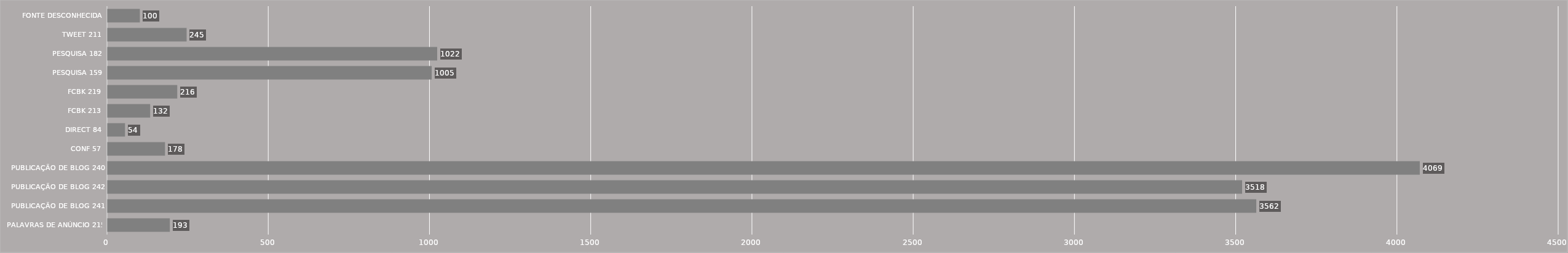
| Category | Series 0 |
|---|---|
| PALAVRAS DE ANÚNCIO 215 | 193 |
| PUBLICAÇÃO DE BLOG 241 | 3562 |
| PUBLICAÇÃO DE BLOG 242 | 3518 |
| PUBLICAÇÃO DE BLOG 240 | 4069 |
| CONF 57 | 178 |
| DIRECT 84 | 54 |
| FCBK 213 | 132 |
| FCBK 219 | 216 |
| PESQUISA 159 | 1005 |
| PESQUISA 182 | 1022 |
| TWEET 211 | 245 |
| FONTE DESCONHECIDA | 100 |